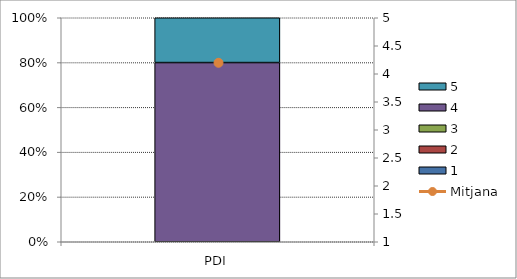
| Category | 1 | 2 | 3 | 4 | 5 |
|---|---|---|---|---|---|
| PDI | 0 | 0 | 0 | 8 | 2 |